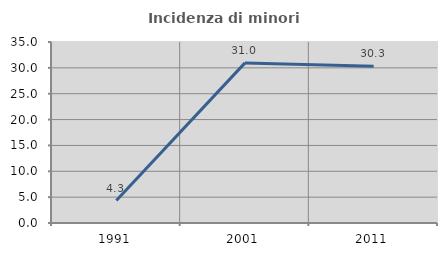
| Category | Incidenza di minori stranieri |
|---|---|
| 1991.0 | 4.348 |
| 2001.0 | 30.96 |
| 2011.0 | 30.316 |